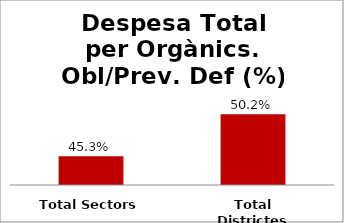
| Category | Series 0 |
|---|---|
| Total Sectors | 0.453 |
| Total Districtes | 0.502 |